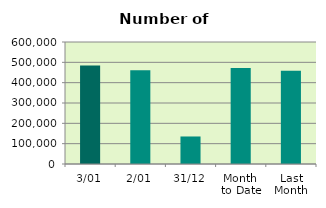
| Category | Series 0 |
|---|---|
| 3/01 | 484546 |
| 2/01 | 460588 |
| 31/12 | 135336 |
| Month 
to Date | 472567 |
| Last
Month | 458836.4 |